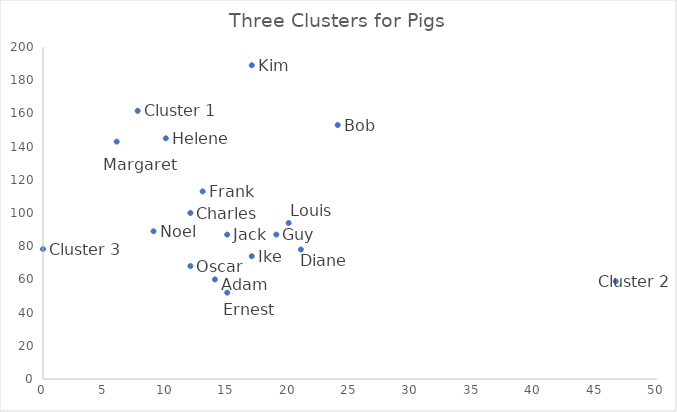
| Category | Series 0 |
|---|---|
| 7.709116557477562 | 161.546 |
| 46.635992758548674 | 58.831 |
| 0.0 | 78.259 |
| 14.0 | 60 |
| 24.0 | 153 |
| 12.0 | 100 |
| 21.0 | 78 |
| 15.0 | 52 |
| 13.0 | 113 |
| 19.0 | 87 |
| 10.0 | 145 |
| 17.0 | 74 |
| 15.0 | 87 |
| 17.0 | 189 |
| 20.0 | 94 |
| 6.0 | 143 |
| 9.0 | 89 |
| 12.0 | 68 |